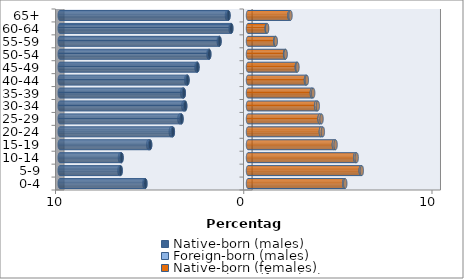
| Category | Native-born (males) | Foreign-born (males) | Native-born (females) | Foreign-born (females) |
|---|---|---|---|---|
| 0-4 | -5.452 | -0.052 | 5.114 | 0.052 |
| 5-9 | -6.765 | -0.062 | 5.989 | 0.057 |
| 10-14 | -6.718 | -0.082 | 5.699 | 0.075 |
| 15-19 | -5.2 | -0.096 | 4.563 | 0.09 |
| 20-24 | -3.992 | -0.109 | 3.872 | 0.104 |
| 25-29 | -3.533 | -0.108 | 3.804 | 0.102 |
| 30-34 | -3.337 | -0.098 | 3.619 | 0.09 |
| 35-39 | -3.41 | -0.083 | 3.394 | 0.068 |
| 40-44 | -3.214 | -0.065 | 3.078 | 0.047 |
| 45-49 | -2.686 | -0.051 | 2.593 | 0.034 |
| 50-54 | -2.057 | -0.043 | 1.972 | 0.027 |
| 55-59 | -1.514 | -0.039 | 1.449 | 0.023 |
| 60-64 | -0.888 | -0.037 | 0.995 | 0.021 |
| 65+ | -1.038 | -0.078 | 2.205 | 0.052 |